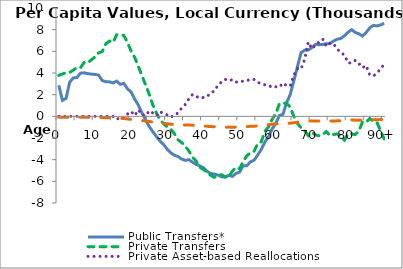
| Category | Public Transfers* | Private Transfers | Private Asset-based Reallocations | Public Asset-based Reallocations |
|---|---|---|---|---|
| 0 | 2865.444 | 3781.773 | 0.171 | -73.318 |
|  | 1472.385 | 3903.995 | 0.174 | -76.305 |
| 2 | 1657.685 | 4026.216 | 0.177 | -79.293 |
| 3 | 3146.665 | 4051.515 | 0.17 | -80.61 |
| 4 | 3547.492 | 4261.076 | -0.163 | -81.487 |
| 5 | 3584.107 | 4496.962 | -0.178 | -84.576 |
| 6 | 3985.455 | 4495.82 | -0.023 | -86.436 |
| 7 | 4016.512 | 4969.909 | -0.314 | -89.965 |
| 8 | 3943.607 | 4930.979 | -0.019 | -93.188 |
| 9 | 3894.745 | 5221.573 | -0.013 | -98.185 |
| 10 | 3870.354 | 5480.293 | -0.064 | -102.695 |
| 11 | 3807.934 | 5863.558 | -0.219 | -108.416 |
| 12 | 3305.889 | 5973.309 | -0.029 | -113.999 |
| 13 | 3196.52 | 6681.525 | -0.27 | -121.808 |
| 14 | 3181.846 | 6949.534 | -0.287 | -127.136 |
| 15 | 3083.854 | 6821.268 | 0.176 | -135.095 |
| 16 | 3251.653 | 7529 | -279.282 | -164.875 |
| 17 | 2959.004 | 7521.821 | -97.839 | -182.107 |
| 18 | 3036.51 | 7459.323 | -157.969 | -199.841 |
| 19 | 2545.356 | 6822.177 | 213.806 | -243.127 |
| 20 | 2240.844 | 6022.172 | 455.55 | -277.83 |
| 21 | 1583.681 | 5432.596 | 74.242 | -312.975 |
| 22 | 1034.923 | 4616.493 | 594.01 | -350.889 |
| 23 | 319.867 | 3742.144 | 173.729 | -393.608 |
| 24 | -313.111 | 2910.857 | 37.027 | -436.061 |
| 25 | -933.117 | 2049.668 | 503.925 | -476.287 |
| 26 | -1412.139 | 1060.309 | 312.209 | -528.475 |
| 27 | -1857.079 | 314.734 | 47.062 | -571.721 |
| 28 | -2283.493 | -316.628 | 434.181 | -615.005 |
| 29 | -2601.687 | -685.093 | 248.879 | -647.736 |
| 30 | -3051.958 | -980.581 | 135.547 | -687.34 |
| 31 | -3378.253 | -1198.507 | -88.006 | -727.35 |
| 32 | -3592.911 | -1614.956 | 160.195 | -754.799 |
| 33 | -3716.168 | -2175.511 | 304.204 | -768.437 |
| 34 | -3951.724 | -2420.399 | 765.854 | -795.311 |
| 35 | -4063.549 | -2767.526 | 1099.571 | -800.94 |
| 36 | -4000.932 | -3204.082 | 1621.984 | -795.676 |
| 37 | -4239.038 | -3773.686 | 2022.271 | -823.006 |
| 38 | -4442.704 | -4135.221 | 1852.798 | -847.73 |
| 39 | -4563.37 | -4709.72 | 1668.181 | -862.717 |
| 40 | -4737.898 | -4901.406 | 1743.747 | -880.718 |
| 41 | -5068.315 | -5161.43 | 1818.478 | -920.783 |
| 42 | -5278.507 | -5442.524 | 2172.631 | -946.142 |
| 43 | -5329.201 | -5628.983 | 2322.078 | -955.39 |
| 44 | -5416.406 | -5455.948 | 2856.454 | -968.944 |
| 45 | -5580.549 | -5387.875 | 3173.784 | -990.661 |
| 46 | -5613.006 | -5592.58 | 3415.775 | -1008.856 |
| 47 | -5440.292 | -5583.034 | 3295.303 | -991.712 |
| 48 | -5543.185 | -5065.185 | 3383.264 | -1011.806 |
| 49 | -5274.169 | -4714.83 | 3149.312 | -987.879 |
| 50 | -5146.313 | -4831.631 | 3246.03 | -982.181 |
| 51 | -4558.949 | -4179.174 | 3232.789 | -940.265 |
| 52 | -4560.434 | -3641.095 | 3282.211 | -948.205 |
| 53 | -4196.79 | -3377.548 | 3432.724 | -920.02 |
| 54 | -4050.885 | -3223.809 | 3402.98 | -917.744 |
| 55 | -3579.458 | -2538.662 | 3129.29 | -878.004 |
| 56 | -3060.129 | -2355.28 | 3038.806 | -853.754 |
| 57 | -2375.947 | -1385.815 | 2913.245 | -787.803 |
| 58 | -1892.9 | -967.276 | 2877.582 | -768.072 |
| 59 | -1166.122 | -278.303 | 2654.61 | -719.567 |
| 60 | -668.084 | 207.102 | 2726.502 | -696.778 |
| 61 | 78.161 | 1149.013 | 2693.134 | -672.423 |
| 62 | 187.896 | 1214.35 | 3071.032 | -696.75 |
| 63 | 1256.114 | 1203.451 | 2837.391 | -646.969 |
| 64 | 2009.327 | 859.12 | 2788.855 | -633.553 |
| 65 | 3263.842 | -8.265 | 3793.61 | -590.298 |
| 66 | 4578.149 | -636.973 | 4416.301 | -547.361 |
| 67 | 5875.497 | -1064.834 | 4365.954 | -468.127 |
| 68 | 6106.086 | -1326.423 | 5246.076 | -443.825 |
| 69 | 6112.758 | -1775.223 | 6863.039 | -445.543 |
| 70 | 6348.182 | -1491.544 | 6238.706 | -428.357 |
| 71 | 6635.08 | -1716.615 | 6558.557 | -428.407 |
| 72 | 6611.327 | -1789.358 | 6865.74 | -432.788 |
| 73 | 6638.62 | -1671.645 | 7123.999 | -426.296 |
| 74 | 6698.327 | -1404.169 | 6460.618 | -415.858 |
| 75 | 6715.072 | -1776.278 | 6752.858 | -420.945 |
| 76 | 6955.503 | -1672.11 | 6684.585 | -436.648 |
| 77 | 7116.104 | -1627.25 | 6206.897 | -413.504 |
| 78 | 7186.72 | -1884.809 | 5892.302 | -402.637 |
| 79 | 7437.66 | -2194.026 | 5656.021 | -370.187 |
| 80 | 7754.143 | -1612.091 | 4932.348 | -358.937 |
| 81 | 7998.548 | -1621.598 | 4928.215 | -326.381 |
| 82 | 7743.308 | -1677.683 | 5167.204 | -353.954 |
| 83 | 7619.954 | -1343.904 | 4875.692 | -355.43 |
| 84 | 7408.76 | -518.112 | 4487.855 | -367.899 |
| 85 | 7730.552 | -542.166 | 4696.543 | -364.292 |
| 86 | 8161.66 | -204.138 | 3827.461 | -347.046 |
| 87 | 8394.139 | -447.512 | 3726.825 | -309.251 |
| 88 | 8343.35 | -567.623 | 3974.336 | -311.65 |
| 89 | 8439.914 | -1330.595 | 4390.797 | -296.902 |
| 90+ | 8581.539 | -2093.567 | 4804.757 | -282.218 |